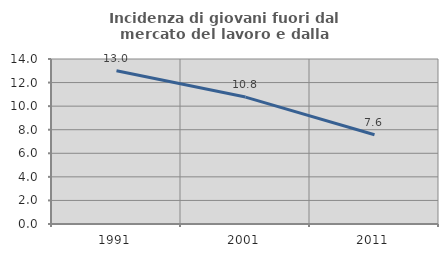
| Category | Incidenza di giovani fuori dal mercato del lavoro e dalla formazione  |
|---|---|
| 1991.0 | 13 |
| 2001.0 | 10.769 |
| 2011.0 | 7.576 |